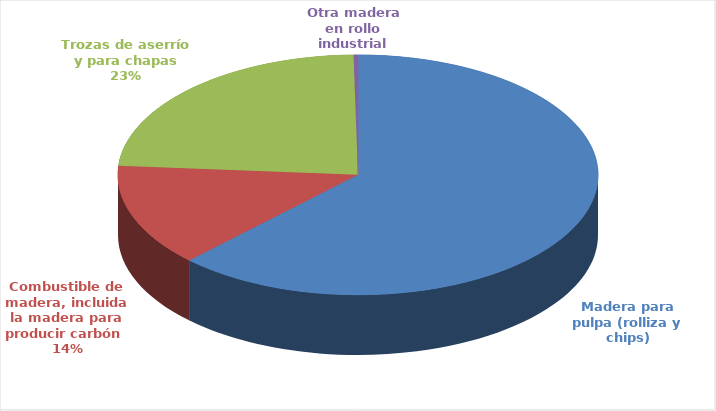
| Category | Series 0 |
|---|---|
| Madera para pulpa (rolliza y chips) | 10608.178 |
| Combustible de madera, incluida la madera para producir carbón  | 2352.318 |
| Trozas de aserrío y para chapas | 3995.515 |
| Otra madera en rollo industrial | 50 |